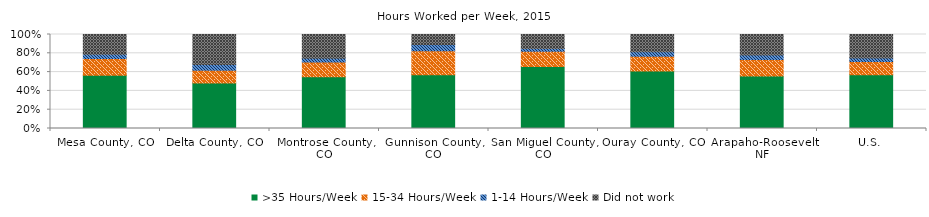
| Category | >35 Hours/Week | 15-34 Hours/Week | 1-14 Hours/Week | Did not work |
|---|---|---|---|---|
| Gallatin County, MT | 0.614 | 0.211 | 0.049 | 0.127 |
| County Region | 0.614 | 0.211 | 0.049 | 0.127 |
| U.S. | 0.578 | 0.143 | 0.036 | 0.243 |